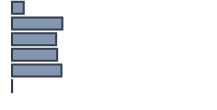
| Category | Series 0 |
|---|---|
| 0 | 5.832 |
| 1 | 25.067 |
| 2 | 21.965 |
| 3 | 22.472 |
| 4 | 24.603 |
| 5 | 0.062 |